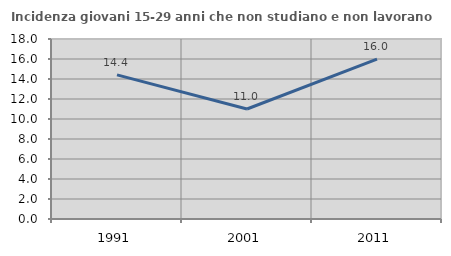
| Category | Incidenza giovani 15-29 anni che non studiano e non lavorano  |
|---|---|
| 1991.0 | 14.414 |
| 2001.0 | 10.998 |
| 2011.0 | 15.978 |